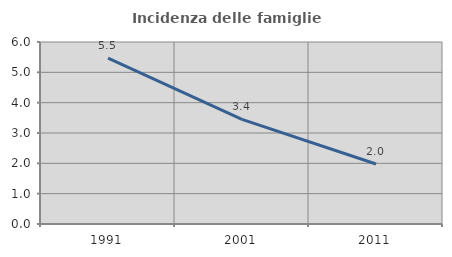
| Category | Incidenza delle famiglie numerose |
|---|---|
| 1991.0 | 5.471 |
| 2001.0 | 3.448 |
| 2011.0 | 1.979 |